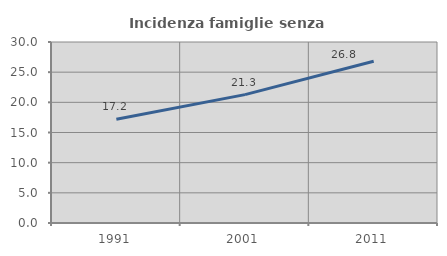
| Category | Incidenza famiglie senza nuclei |
|---|---|
| 1991.0 | 17.192 |
| 2001.0 | 21.275 |
| 2011.0 | 26.816 |